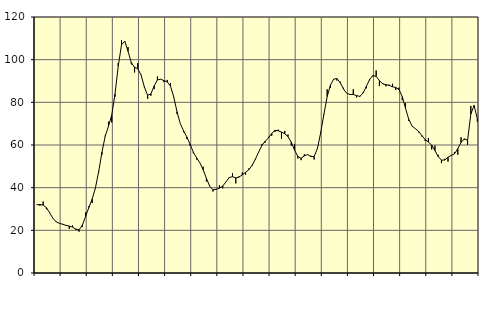
| Category | Piggar | Series 1 |
|---|---|---|
| nan | 31.9 | 32 |
| 87.0 | 31.5 | 32.09 |
| 87.0 | 33.5 | 31.84 |
| 87.0 | 29.9 | 30.66 |
| nan | 28.4 | 28.16 |
| 88.0 | 25.5 | 25.61 |
| 88.0 | 24 | 23.91 |
| 88.0 | 23.2 | 23.28 |
| nan | 23 | 22.83 |
| 89.0 | 22.2 | 22.31 |
| 89.0 | 20.7 | 22 |
| 89.0 | 22.3 | 21.5 |
| nan | 20.8 | 20.48 |
| 90.0 | 19.4 | 20.21 |
| 90.0 | 21.7 | 22.38 |
| 90.0 | 28.4 | 26.5 |
| nan | 31.3 | 30.73 |
| 91.0 | 32.8 | 34.6 |
| 91.0 | 39.6 | 39.81 |
| 91.0 | 47.7 | 47.47 |
| nan | 55.5 | 56.57 |
| 92.0 | 64.4 | 64.08 |
| 92.0 | 70.9 | 68.8 |
| 92.0 | 70.6 | 73.96 |
| nan | 82.6 | 83.82 |
| 93.0 | 98.4 | 97.02 |
| 93.0 | 109.2 | 106.95 |
| 93.0 | 108.5 | 108.73 |
| nan | 105.9 | 103.95 |
| 94.0 | 97.8 | 98.62 |
| 94.0 | 94 | 96.4 |
| 94.0 | 98.4 | 95.74 |
| nan | 92.9 | 92.78 |
| 95.0 | 86.9 | 87.21 |
| 95.0 | 81.6 | 83.26 |
| 95.0 | 83.1 | 83.99 |
| nan | 86.2 | 87.69 |
| 96.0 | 92.2 | 90.52 |
| 96.0 | 90.9 | 90.85 |
| 96.0 | 89.5 | 90.18 |
| nan | 90.5 | 89.58 |
| 97.0 | 89 | 87.57 |
| 97.0 | 82.4 | 82.52 |
| 97.0 | 74.6 | 75.61 |
| nan | 70 | 70.04 |
| 98.0 | 66 | 66.68 |
| 98.0 | 62.8 | 63.81 |
| 98.0 | 59.6 | 60.38 |
| nan | 56.1 | 56.63 |
| 99.0 | 53.2 | 53.98 |
| 99.0 | 51.7 | 51.64 |
| 99.0 | 49.8 | 48.45 |
| nan | 42.9 | 44.41 |
| 0.0 | 41 | 40.71 |
| 0.0 | 38.2 | 39.05 |
| 0.0 | 39.4 | 39.2 |
| nan | 41.1 | 39.79 |
| 1.0 | 39.7 | 40.76 |
| 1.0 | 42.7 | 42.72 |
| 1.0 | 45 | 44.76 |
| nan | 46.8 | 45.15 |
| 2.0 | 42 | 44.59 |
| 2.0 | 45.3 | 44.95 |
| 2.0 | 47.1 | 46.03 |
| nan | 46.1 | 47.2 |
| 3.0 | 49 | 48.44 |
| 3.0 | 50.7 | 50.41 |
| 3.0 | 53.1 | 53.33 |
| nan | 56.6 | 56.67 |
| 4.0 | 60.5 | 59.82 |
| 4.0 | 61.1 | 61.79 |
| 4.0 | 63.8 | 63.26 |
| nan | 64.3 | 65.44 |
| 5.0 | 66.1 | 66.86 |
| 5.0 | 67.2 | 66.67 |
| 5.0 | 62.9 | 66.06 |
| nan | 66.6 | 65.3 |
| 6.0 | 64.9 | 63.93 |
| 6.0 | 59.7 | 61.31 |
| 6.0 | 60.5 | 57.65 |
| nan | 53.7 | 54.65 |
| 7.0 | 52.9 | 53.77 |
| 7.0 | 55.7 | 54.91 |
| 7.0 | 55.3 | 55.53 |
| nan | 55 | 54.56 |
| 8.0 | 53.2 | 54.61 |
| 8.0 | 58.5 | 58.33 |
| 8.0 | 65.9 | 65.66 |
| nan | 74.3 | 74.46 |
| 9.0 | 86.1 | 82.71 |
| 9.0 | 86.8 | 88.13 |
| 9.0 | 90.9 | 90.91 |
| nan | 90.2 | 91.11 |
| 10.0 | 89.7 | 89.18 |
| 10.0 | 86.8 | 86.23 |
| 10.0 | 84.2 | 84.2 |
| nan | 83.6 | 83.7 |
| 11.0 | 86.1 | 83.67 |
| 11.0 | 82.3 | 83.16 |
| 11.0 | 82.6 | 82.81 |
| nan | 84.7 | 84.33 |
| 12.0 | 86.6 | 87.48 |
| 12.0 | 90.4 | 90.74 |
| 12.0 | 92.2 | 92.57 |
| nan | 94.9 | 92.12 |
| 13.0 | 87.6 | 90.18 |
| 13.0 | 89 | 88.63 |
| 13.0 | 87.5 | 88.33 |
| nan | 88.3 | 87.91 |
| 14.0 | 88.7 | 87.3 |
| 14.0 | 85.8 | 86.98 |
| 14.0 | 86.9 | 86.01 |
| nan | 81 | 82.67 |
| 15.0 | 79.7 | 77.18 |
| 15.0 | 71.3 | 71.95 |
| 15.0 | 68.8 | 68.87 |
| nan | 67.6 | 67.67 |
| 16.0 | 65.9 | 66.39 |
| 16.0 | 64 | 64.42 |
| 16.0 | 61.9 | 62.55 |
| nan | 63.3 | 61.37 |
| 17.0 | 57.9 | 59.96 |
| 17.0 | 59.7 | 57.37 |
| 17.0 | 55.4 | 54.6 |
| nan | 51.5 | 52.89 |
| 18.0 | 53.5 | 52.94 |
| 18.0 | 52.2 | 54.28 |
| 18.0 | 55.3 | 55.1 |
| nan | 56.7 | 55.88 |
| 19.0 | 55.4 | 58.27 |
| 19.0 | 63.6 | 61.17 |
| 19.0 | 62.5 | 62.89 |
| nan | 60.1 | 62.18 |
| 20.0 | 78.3 | 74.5 |
| 20.0 | 77.9 | 78.54 |
| 20.0 | 70.9 | 72.19 |